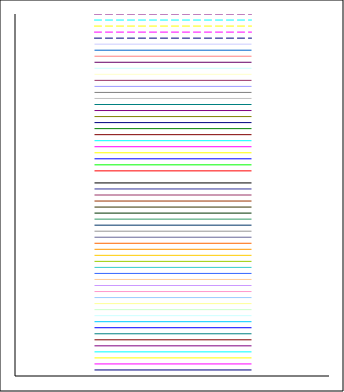
| Category | Series 1 | Series 2 | Series 3 | Series 4 | Series 5 | Series 6 | Series 7 | Series 8 | Series 9 | Series 10 | Series 11 | Series 12 | Series 13 | Series 14 | Series 15 | Series 16 | Series 17 | Series 18 | Series 19 | Series 20 | Series 21 | Series 22 | Series 23 | Series 24 | Series 25 | Series 26 | Series 27 | Series 28 | Series 29 | Series 30 | Series 31 | Series 32 | Series 33 | Series 34 | Series 35 | Series 36 | Series 37 | Series 38 | Series 39 | Series 40 | Series 41 | Series 42 | Series 43 | Series 44 | Series 45 | Series 46 | Series 47 | Series 48 | Series 49 | Series 50 | Series 51 | Series 52 | Series 53 | Series 54 | Series 55 | Series 56 | Series 57 | Series 58 | Series 59 | Series 60 |
|---|---|---|---|---|---|---|---|---|---|---|---|---|---|---|---|---|---|---|---|---|---|---|---|---|---|---|---|---|---|---|---|---|---|---|---|---|---|---|---|---|---|---|---|---|---|---|---|---|---|---|---|---|---|---|---|---|---|---|---|---|
| Point 1 | 1 | 2 | 3 | 4 | 5 | 6 | 7 | 8 | 9 | 10 | 11 | 12 | 13 | 14 | 15 | 16 | 17 | 18 | 19 | 20 | 21 | 22 | 23 | 24 | 25 | 26 | 27 | 28 | 29 | 30 | 31 | 32 | 33 | 34 | 35 | 36 | 37 | 38 | 39 | 40 | 41 | 42 | 43 | 44 | 45 | 46 | 47 | 48 | 49 | 50 | 51 | 52 | 53 | 54 | 55 | 56 | 57 | 58 | 59 | 60 |
| Point 2 | 1 | 2 | 3 | 4 | 5 | 6 | 7 | 8 | 9 | 10 | 11 | 12 | 13 | 14 | 15 | 16 | 17 | 18 | 19 | 20 | 21 | 22 | 23 | 24 | 25 | 26 | 27 | 28 | 29 | 30 | 31 | 32 | 33 | 34 | 35 | 36 | 37 | 38 | 39 | 40 | 41 | 42 | 43 | 44 | 45 | 46 | 47 | 48 | 49 | 50 | 51 | 52 | 53 | 54 | 55 | 56 | 57 | 58 | 59 | 60 |